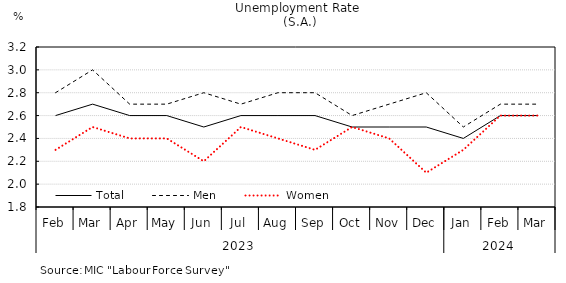
| Category | Total | Men | Women |
|---|---|---|---|
| 0 | 2.6 | 2.8 | 2.3 |
| 1 | 2.7 | 3 | 2.5 |
| 2 | 2.6 | 2.7 | 2.4 |
| 3 | 2.6 | 2.7 | 2.4 |
| 4 | 2.5 | 2.8 | 2.2 |
| 5 | 2.6 | 2.7 | 2.5 |
| 6 | 2.6 | 2.8 | 2.4 |
| 7 | 2.6 | 2.8 | 2.3 |
| 8 | 2.5 | 2.6 | 2.5 |
| 9 | 2.5 | 2.7 | 2.4 |
| 10 | 2.5 | 2.8 | 2.1 |
| 11 | 2.4 | 2.5 | 2.3 |
| 12 | 2.6 | 2.7 | 2.6 |
| 13 | 2.6 | 2.7 | 2.6 |